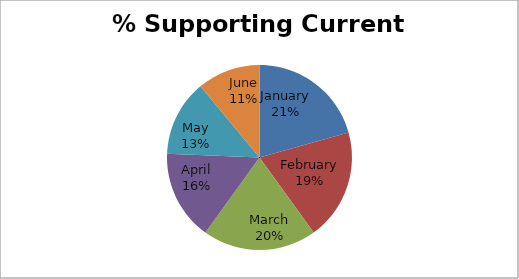
| Category | Series 0 |
|---|---|
| January | 0.674 |
| February | 0.634 |
| March | 0.65 |
| April | 0.513 |
| May | 0.436 |
| June | 0.36 |